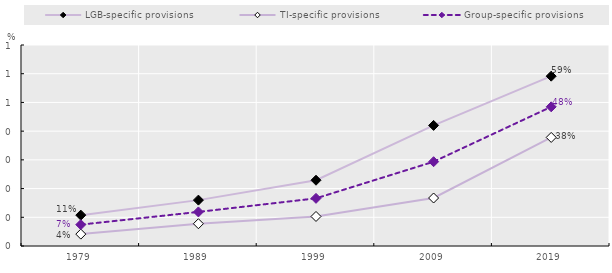
| Category | LGB-specific provisions | TI-specific provisions | Group-specific provisions |
|---|---|---|---|
| 1979.0 | 0.107 | 0.041 | 0.074 |
| 1989.0 | 0.16 | 0.078 | 0.119 |
| 1999.0 | 0.229 | 0.103 | 0.166 |
| 2009.0 | 0.42 | 0.167 | 0.294 |
| 2019.0 | 0.591 | 0.378 | 0.485 |